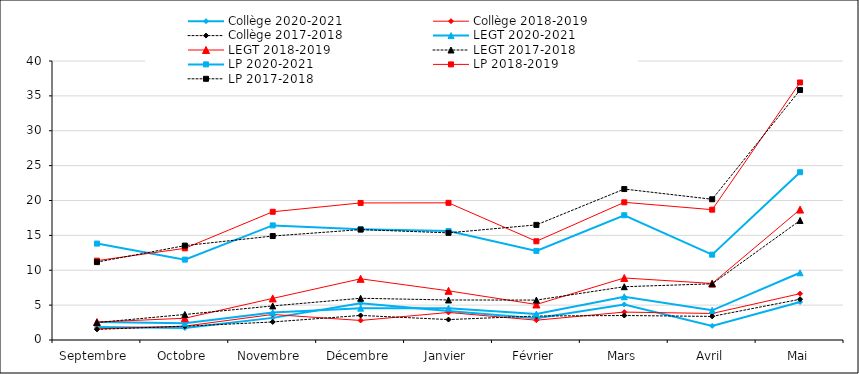
| Category | Collège | LEGT | LP |
|---|---|---|---|
| Septembre | 1.522 | 2.502 | 11.165 |
| Octobre | 1.972 | 3.658 | 13.531 |
| Novembre | 2.587 | 4.887 | 14.906 |
| Décembre | 3.521 | 5.982 | 15.827 |
| Janvier | 2.931 | 5.737 | 15.362 |
| Février | 3.436 | 5.724 | 16.503 |
| Mars | 3.51 | 7.641 | 21.641 |
| Avril | 3.382 | 8.055 | 20.177 |
| Mai | 5.843 | 17.134 | 35.834 |